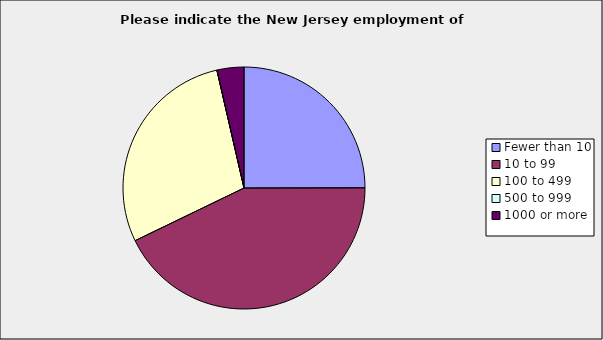
| Category | Series 0 |
|---|---|
| Fewer than 10 | 0.25 |
| 10 to 99 | 0.429 |
| 100 to 499 | 0.286 |
| 500 to 999 | 0 |
| 1000 or more | 0.036 |